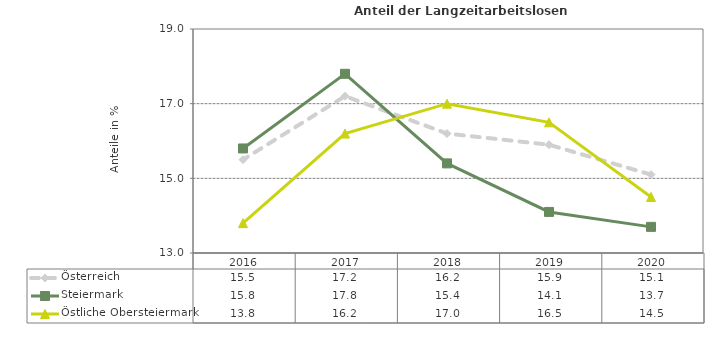
| Category | Österreich | Steiermark | Östliche Obersteiermark |
|---|---|---|---|
| 2020.0 | 15.1 | 13.7 | 14.5 |
| 2019.0 | 15.9 | 14.1 | 16.5 |
| 2018.0 | 16.2 | 15.4 | 17 |
| 2017.0 | 17.2 | 17.8 | 16.2 |
| 2016.0 | 15.5 | 15.8 | 13.8 |